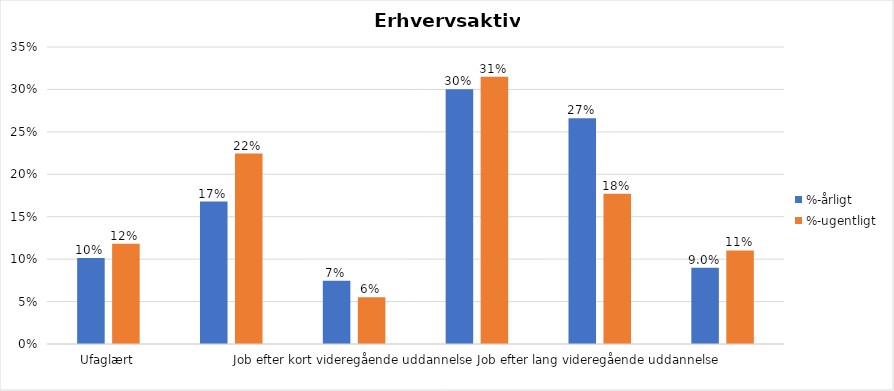
| Category | %-årligt | %-ugentligt |
|---|---|---|
| Ufaglært | 0.101 | 0.118 |
| Erhvervsfagligt job | 0.168 | 0.224 |
| Job efter kort videregående uddannelse | 0.074 | 0.055 |
| Job efter mellemlang videregående uddannelse | 0.3 | 0.315 |
| Job efter lang videregående uddannelse | 0.266 | 0.177 |
| Selvstændig | 0.09 | 0.11 |